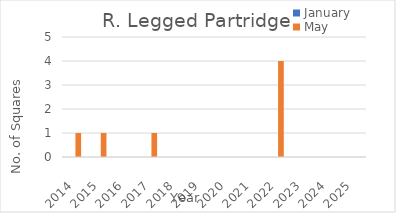
| Category | January | May |
|---|---|---|
| 2014.0 | 0 | 1 |
| 2015.0 | 0 | 1 |
| 2016.0 | 0 | 0 |
| 2017.0 | 0 | 1 |
| 2018.0 | 0 | 0 |
| 2019.0 | 0 | 0 |
| 2020.0 | 0 | 0 |
| 2021.0 | 0 | 0 |
| 2022.0 | 0 | 4 |
| 2023.0 | 0 | 0 |
| 2024.0 | 0 | 0 |
| 2025.0 | 0 | 0 |